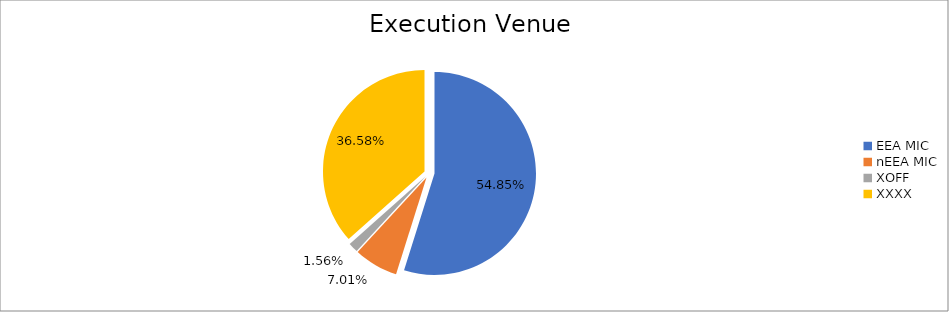
| Category | Series 0 |
|---|---|
| EEA MIC | 6496993.211 |
| nEEA MIC | 830212.089 |
| XOFF | 185025.947 |
| XXXX | 4332862.068 |